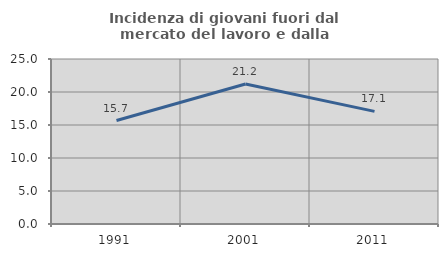
| Category | Incidenza di giovani fuori dal mercato del lavoro e dalla formazione  |
|---|---|
| 1991.0 | 15.679 |
| 2001.0 | 21.216 |
| 2011.0 | 17.066 |